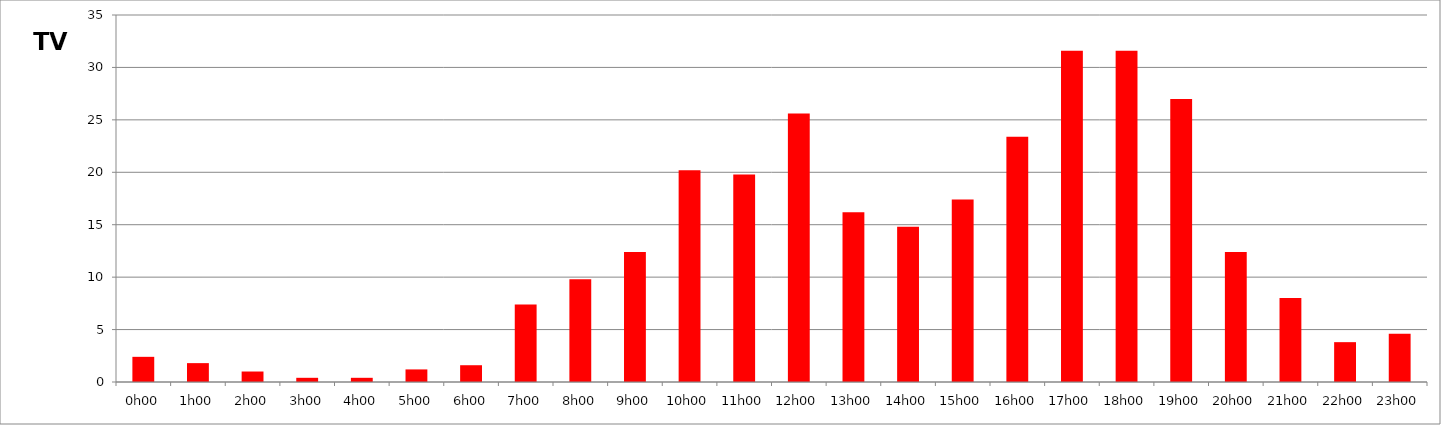
| Category | TV |
|---|---|
| 0.0 | 2.4 |
| 0.041666666666666664 | 1.8 |
| 0.08333333333333333 | 1 |
| 0.125 | 0.4 |
| 0.16666666666666666 | 0.4 |
| 0.20833333333333334 | 1.2 |
| 0.25 | 1.6 |
| 0.2916666666666667 | 7.4 |
| 0.3333333333333333 | 9.8 |
| 0.375 | 12.4 |
| 0.4166666666666667 | 20.2 |
| 0.4583333333333333 | 19.8 |
| 0.5 | 25.6 |
| 0.5416666666666666 | 16.2 |
| 0.5833333333333334 | 14.8 |
| 0.625 | 17.4 |
| 0.6666666666666666 | 23.4 |
| 0.7083333333333334 | 31.6 |
| 0.75 | 31.6 |
| 0.7916666666666666 | 27 |
| 0.8333333333333334 | 12.4 |
| 0.875 | 8 |
| 0.9166666666666666 | 3.8 |
| 0.9583333333333334 | 4.6 |